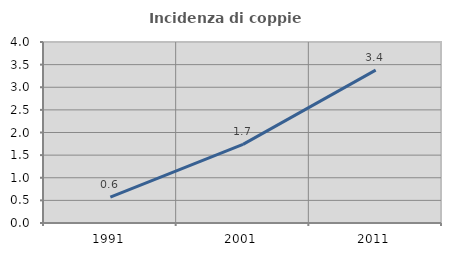
| Category | Incidenza di coppie miste |
|---|---|
| 1991.0 | 0.57 |
| 2001.0 | 1.739 |
| 2011.0 | 3.379 |